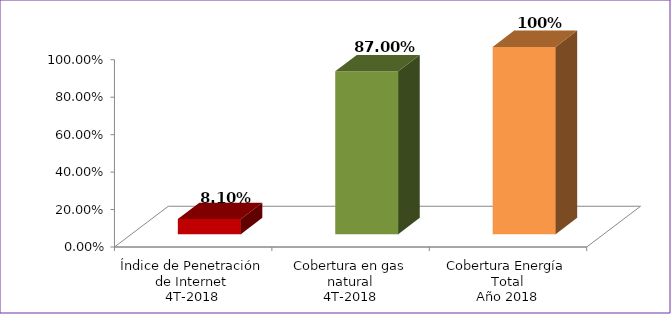
| Category | Series 0 |
|---|---|
| Índice de Penetración de Internet
4T-2018 | 0.081 |
| Cobertura en gas natural
4T-2018 | 0.87 |
| Cobertura Energía Total
Año 2018 | 1 |